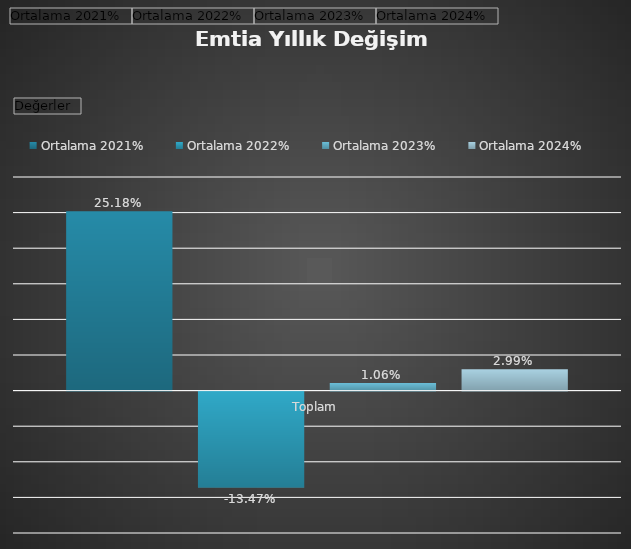
| Category | Ortalama 2021% | Ortalama 2022% | Ortalama 2023% | Ortalama 2024% |
|---|---|---|---|---|
| Toplam | 0.252 | -0.135 | 0.011 | 0.03 |